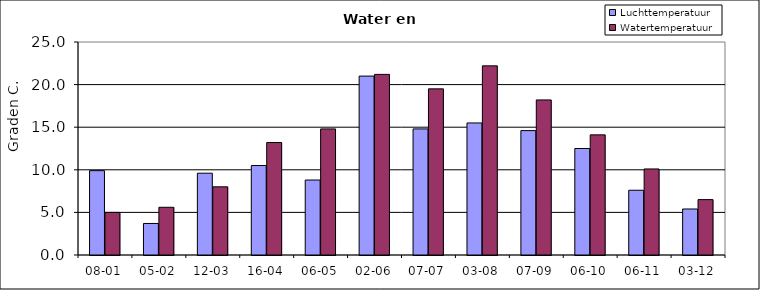
| Category | Luchttemperatuur | Watertemperatuur |
|---|---|---|
| 08-01 | 9.9 | 5 |
| 05-02 | 3.7 | 5.6 |
| 12-03 | 9.6 | 8 |
| 16-04 | 10.5 | 13.2 |
| 06-05 | 8.8 | 14.8 |
| 02-06 | 21 | 21.2 |
| 07-07 | 14.8 | 19.5 |
| 03-08 | 15.5 | 22.2 |
| 07-09 | 14.6 | 18.2 |
| 06-10 | 12.5 | 14.1 |
| 06-11 | 7.6 | 10.1 |
| 03-12 | 5.4 | 6.5 |